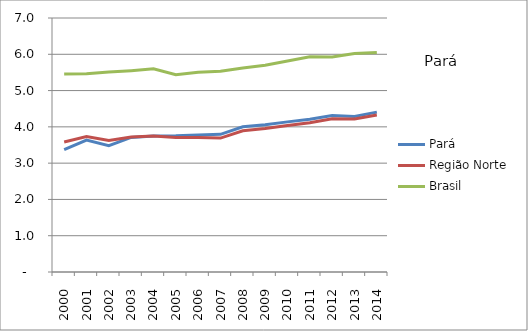
| Category | Pará | Região Norte | Brasil |
|---|---|---|---|
| 2000.0 | 3.373 | 3.584 | 5.458 |
| 2001.0 | 3.637 | 3.732 | 5.467 |
| 2002.0 | 3.481 | 3.625 | 5.513 |
| 2003.0 | 3.708 | 3.72 | 5.549 |
| 2004.0 | 3.749 | 3.745 | 5.599 |
| 2005.0 | 3.755 | 3.709 | 5.438 |
| 2006.0 | 3.774 | 3.704 | 5.507 |
| 2007.0 | 3.794 | 3.69 | 5.531 |
| 2008.0 | 4.003 | 3.894 | 5.623 |
| 2009.0 | 4.057 | 3.953 | 5.699 |
| 2010.0 | 4.137 | 4.037 | 5.816 |
| 2011.0 | 4.21 | 4.116 | 5.93 |
| 2012.0 | 4.311 | 4.224 | 5.928 |
| 2013.0 | 4.285 | 4.216 | 6.021 |
| 2014.0 | 4.406 | 4.325 | 6.051 |